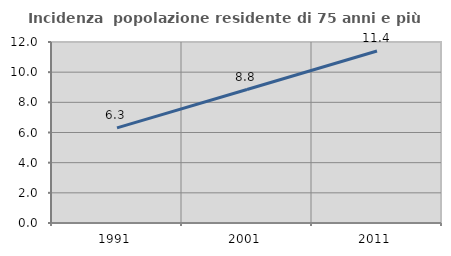
| Category | Incidenza  popolazione residente di 75 anni e più |
|---|---|
| 1991.0 | 6.308 |
| 2001.0 | 8.847 |
| 2011.0 | 11.4 |